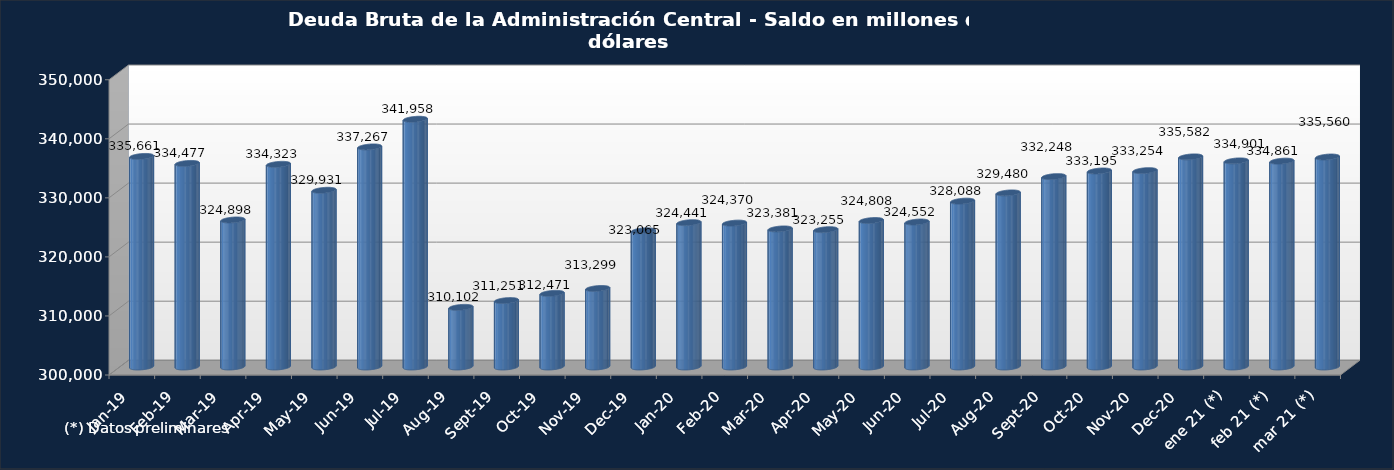
| Category | Series 0 |
|---|---|
| ene-19 | 335661.3 |
| feb-19 | 334477 |
| mar-19 | 324898.3 |
| abr-19 | 334322.9 |
| may-19 | 329930.6 |
| jun-19 | 337267.1 |
| jul-19 | 341957.5 |
| ago-19 | 310102.3 |
| sep-19 | 311251.2 |
| oct-19 | 312471 |
| nov-19 | 313299.1 |
| dic-19 | 323064.6 |
| ene-20 | 324440.6 |
| feb-20 | 324369.9 |
| mar-20 | 323381.2 |
| abr-20 | 323254.8 |
| may-20 | 324808.3 |
| jun-20 | 324552.4 |
| jul-20 | 328087.9 |
| ago-20 | 329479.5 |
| sep-20 | 332247.5 |
| oct-20 | 333194.7 |
| nov-20 | 333253.8 |
| dic-20 | 335582.2 |
| ene 21 (*) | 334900.8 |
| feb 21 (*) | 334860.9 |
| mar 21 (*) | 335559.5 |